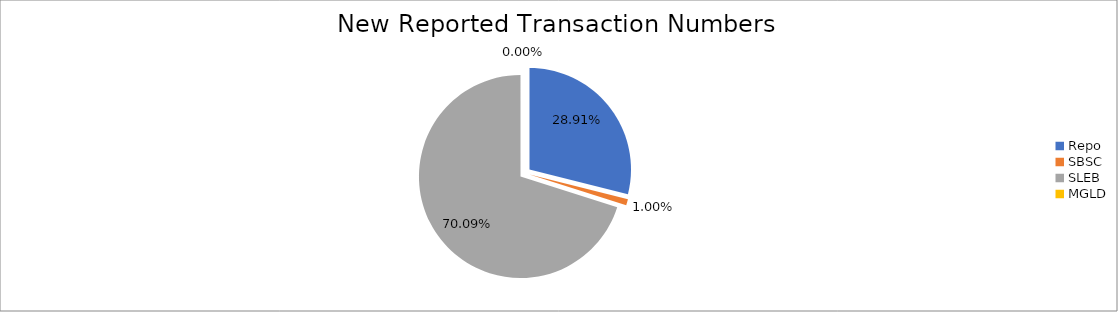
| Category | Series 0 |
|---|---|
| Repo | 286492 |
| SBSC | 9877 |
| SLEB | 694514 |
| MGLD | 27 |